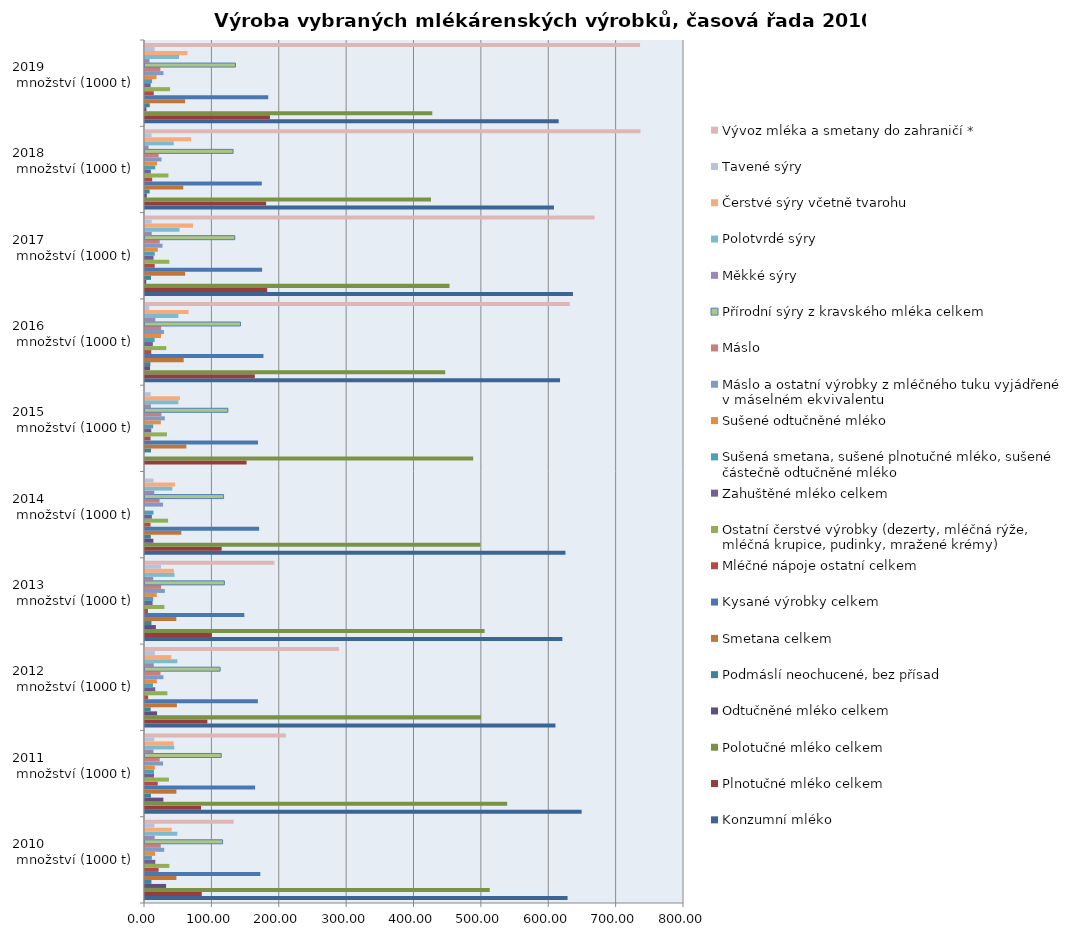
| Category | Konzumní mléko | Plnotučné mléko celkem | Polotučné mléko celkem | Odtučněné mléko celkem | Podmáslí neochucené, bez přísad | Smetana celkem | Kysané výrobky celkem | Mléčné nápoje ostatní celkem | Ostatní čerstvé výrobky (dezerty, mléčná rýže, mléčná krupice, pudinky, mražené krémy) | Zahuštěné mléko celkem | Sušená smetana, sušené plnotučné mléko, sušené částečně odtučněné mléko | Sušené odtučněné mléko | Máslo a ostatní výrobky z mléčného tuku vyjádřené v máselném ekvivalentu | Máslo | Přírodní sýry z kravského mléka celkem | Měkké sýry | Polotvrdé sýry | Čerstvé sýry včetně tvarohu | Tavené sýry | Vývoz mléka a smetany do zahraničí * |
|---|---|---|---|---|---|---|---|---|---|---|---|---|---|---|---|---|---|---|---|---|
| 2010                       množství (1000 t) | 627.18 | 84.22 | 511.65 | 31.31 | 9.59 | 46.62 | 171.22 | 20.13 | 36.24 | 15.3 | 10.16 | 14.83 | 28.58 | 23.38 | 115.16 | 14.33 | 47.97 | 39.7 | 13.95 | 131.59 |
| 2011                       množství (1000 t) | 648.01 | 83.17 | 537.55 | 27.29 | 8.79 | 46.62 | 163.41 | 18.87 | 35.54 | 13.31 | 13.29 | 14.54 | 26.86 | 21.89 | 113.12 | 12.61 | 43.36 | 42.51 | 13.62 | 209.08 |
| 2012                       množství (1000 t) | 609.23 | 92.58 | 498.716 | 17.934 | 8.47 | 47.348 | 167.509 | 4.704 | 33.235 | 15.214 | 11.801 | 17.623 | 27.304 | 23.02 | 111.547 | 12.989 | 48.011 | 39.071 | 14.567 | 287.857 |
| 2013                       množství (1000 t) | 619.496 | 99.29 | 504.066 | 16.14 | 9.599 | 46.497 | 147.41 | 4.388 | 28.818 | 11.26 | 12.18 | 17.469 | 29.49 | 23.983 | 117.79 | 12.197 | 43.859 | 42.885 | 23.79 | 191.98 |
| 2014                       množství (1000 t) | 624.03 | 113.793 | 497.797 | 12.44 | 8.625 | 53.93 | 169.37 | 8.137 | 34.317 | 10.19 | 12.54 | 0 | 26.8 | 21.68 | 116.64 | 13.784 | 40.596 | 44.46 | 12.652 | 0 |
| 2015                       množství (1000 t) | 0 | 150.765 | 487.11 | 0 | 8.965 | 61.426 | 167.754 | 8.26 | 32.576 | 9.299 | 12.205 | 23.564 | 29.434 | 24.416 | 123.008 | 8.651 | 49.513 | 51.87 | 8.376 | 0 |
| 2016                       množství (1000 t) | 616.03 | 162.96 | 445.58 | 7.48 | 8.02 | 57.39 | 175.854 | 9.33 | 31.58 | 11.62 | 14.25 | 23.77 | 28.13 | 23.98 | 141.72 | 15.29 | 49.5 | 64.78 | 6.36 | 630.38 |
| 2017                       množství (1000 t) | 635.193 | 181.38 | 451.944 | 1.864 | 8.952 | 59.612 | 173.806 | 14.402 | 36.101 | 12.683 | 14.511 | 19.036 | 26.048 | 21.9 | 133.291 | 9.99 | 51.242 | 71.304 | 9.897 | 667.272 |
| 2018                       množství (1000 t) | 606.96 | 179.73 | 424.5 | 2.72 | 6.89 | 56.84 | 173.36 | 10.68 | 34.8 | 8.63 | 15.17 | 17.94 | 24.61 | 20.23 | 130.76 | 5.27 | 42.72 | 68.29 | 9.74 | 735.43 |
| 2019                       množství (1000 t) | 613.97 | 185.43 | 426.44 | 2.1 | 7.1 | 59.56 | 182.9 | 13.04 | 37.2 | 8.41 | 10.471 | 17.11 | 27.42 | 22.8 | 134.31 | 6.73 | 50.48 | 63.15 | 14.31 | 734.87 |